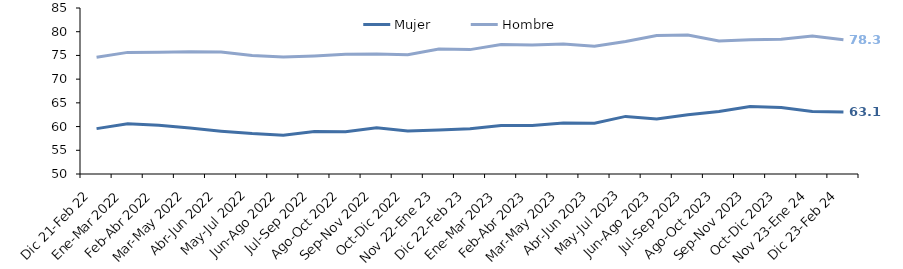
| Category | Mujer | Hombre |
|---|---|---|
| Dic 21-Feb 22 | 59.567 | 74.618 |
| Ene-Mar 2022 | 60.596 | 75.642 |
| Feb-Abr 2022 | 60.291 | 75.665 |
| Mar-May 2022 | 59.678 | 75.78 |
| Abr-Jun 2022 | 59.025 | 75.746 |
| May-Jul 2022 | 58.515 | 74.967 |
| Jun-Ago 2022 | 58.17 | 74.655 |
| Jul-Sep 2022 | 58.944 | 74.9 |
| Ago-Oct 2022 | 58.89 | 75.241 |
| Sep-Nov 2022 | 59.737 | 75.32 |
| Oct-Dic 2022 | 59.093 | 75.124 |
| Nov 22-Ene 23 | 59.276 | 76.351 |
| Dic 22-Feb 23 | 59.528 | 76.225 |
| Ene-Mar 2023 | 60.241 | 77.322 |
| Feb-Abr 2023 | 60.231 | 77.219 |
| Mar-May 2023 | 60.749 | 77.409 |
| Abr-Jun 2023 | 60.716 | 76.952 |
| May-Jul 2023 | 62.146 | 77.941 |
| Jun-Ago 2023 | 61.6 | 79.181 |
| Jul-Sep 2023 | 62.486 | 79.307 |
| Ago-Oct 2023 | 63.193 | 78.03 |
| Sep-Nov 2023 | 64.23 | 78.312 |
| Oct-Dic 2023 | 64.03 | 78.425 |
| Nov 23-Ene 24 | 63.182 | 79.069 |
| Dic 23-Feb 24 | 63.064 | 78.294 |